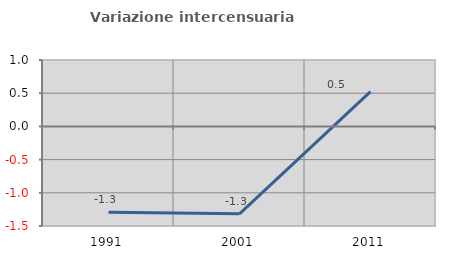
| Category | Variazione intercensuaria annua |
|---|---|
| 1991.0 | -1.291 |
| 2001.0 | -1.316 |
| 2011.0 | 0.523 |